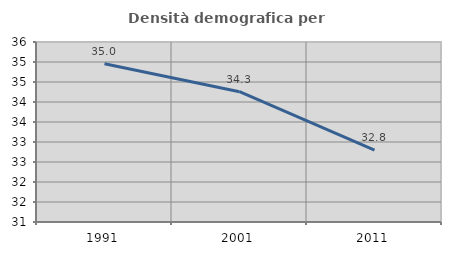
| Category | Densità demografica |
|---|---|
| 1991.0 | 34.954 |
| 2001.0 | 34.258 |
| 2011.0 | 32.796 |